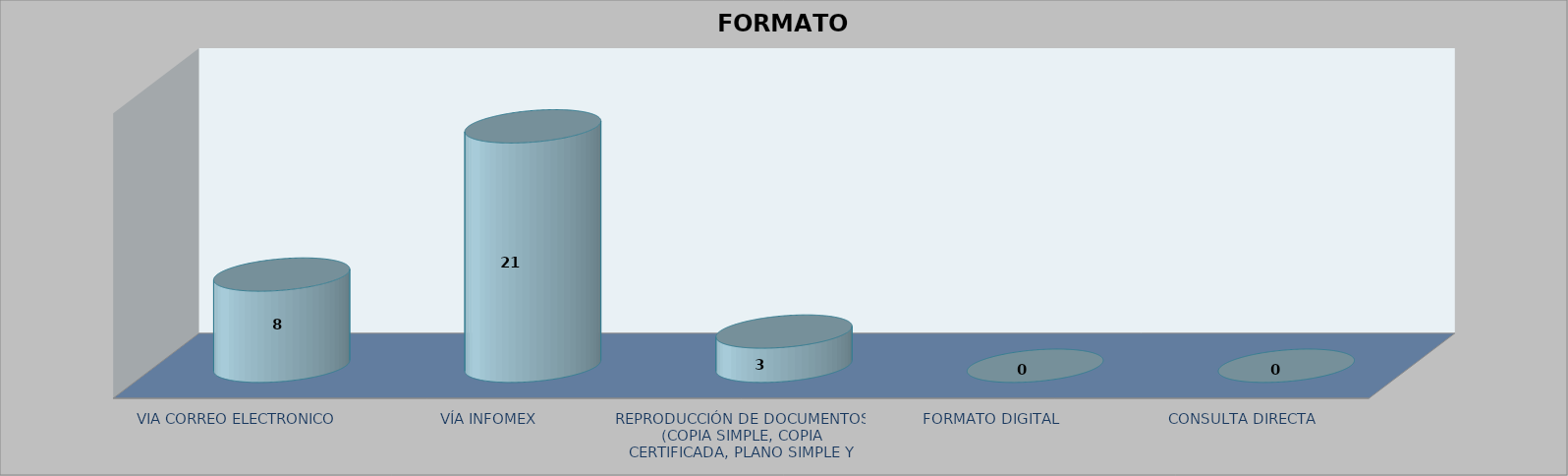
| Category |        FORMATO SOLICITADO | Series 1 | Series 2 |
|---|---|---|---|
| VIA CORREO ELECTRONICO |  |  | 8 |
| VÍA INFOMEX |  |  | 21 |
| REPRODUCCIÓN DE DOCUMENTOS (COPIA SIMPLE, COPIA CERTIFICADA, PLANO SIMPLE Y PLANO CERTIFICADO) |  |  | 3 |
| FORMATO DIGITAL |  |  | 0 |
| CONSULTA DIRECTA |  |  | 0 |